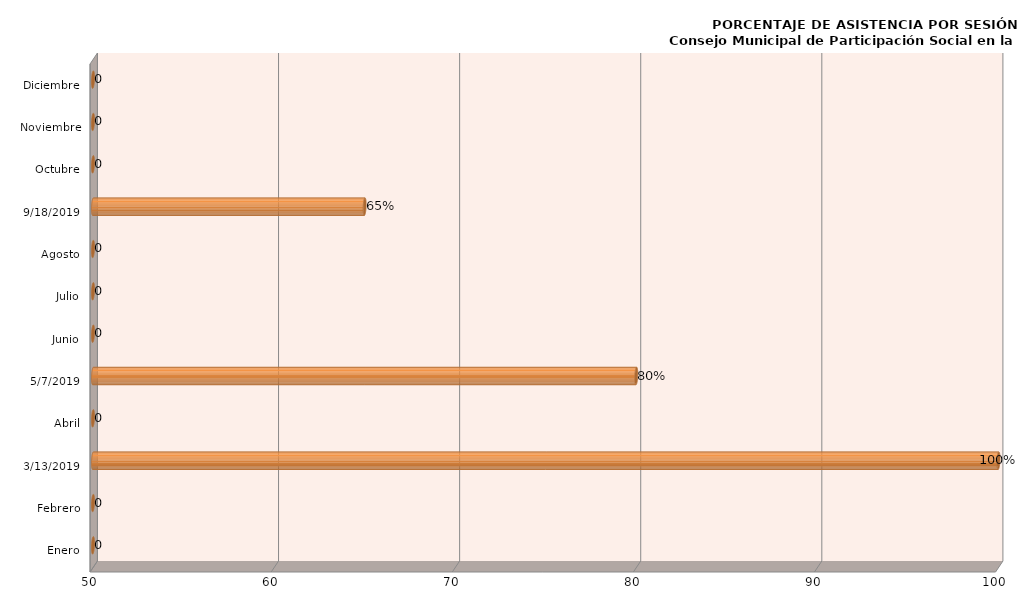
| Category | Series 0 |
|---|---|
| Enero | 0 |
| Febrero | 0 |
| 13/03/2019 | 100 |
| Abril | 0 |
| 07/05/2019 | 80 |
| Junio | 0 |
| Julio | 0 |
| Agosto | 0 |
| 18/09/2019 | 65 |
| Octubre | 0 |
| Noviembre | 0 |
| Diciembre | 0 |